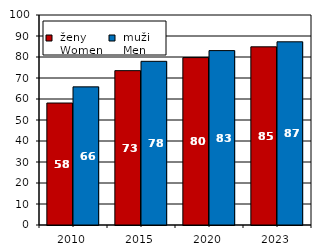
| Category |  ženy 
 Women |  muži 
 Men |
|---|---|---|
| 2010.0 | 58.083 | 65.781 |
| 2015.0 | 73.498 | 77.942 |
| 2020.0 | 79.718 | 83.05 |
| 2023.0 | 84.848 | 87.233 |